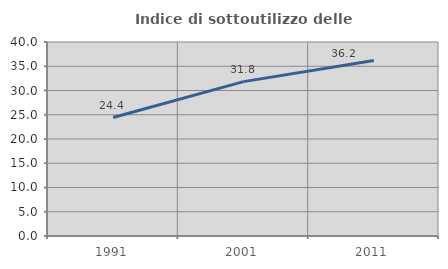
| Category | Indice di sottoutilizzo delle abitazioni  |
|---|---|
| 1991.0 | 24.425 |
| 2001.0 | 31.83 |
| 2011.0 | 36.204 |